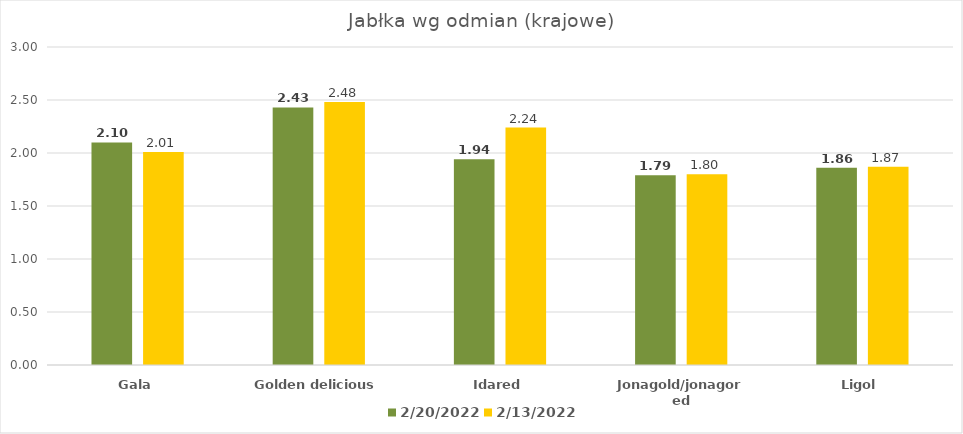
| Category | 20.02.2022 | 13.02.2022 |
|---|---|---|
| Gala | 2.1 | 2.01 |
| Golden delicious | 2.43 | 2.48 |
| Idared | 1.94 | 2.24 |
| Jonagold/jonagored | 1.79 | 1.8 |
| Ligol | 1.86 | 1.87 |